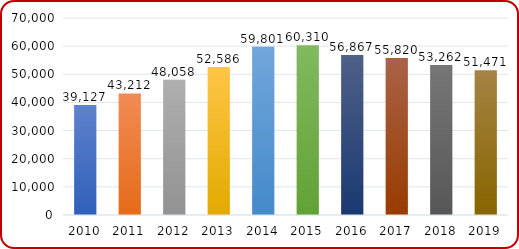
| Category | Total Enrolment |
|---|---|
| 2010 | 39127 |
| 2011 | 43212 |
| 2012 | 48058 |
| 2013 | 52586 |
| 2014 | 59801 |
| 2015 | 60310 |
| 2016 | 56867 |
| 2017 | 55820 |
| 2018 | 53262 |
| 2019 | 51471 |